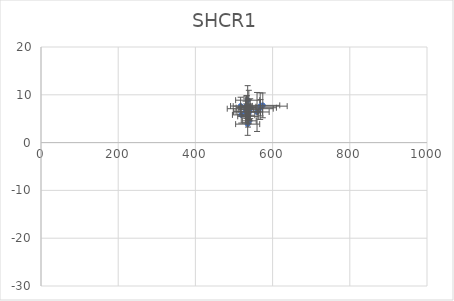
| Category | SHCR1 |
|---|---|
| 529.728784934635 | 6.41 |
| 535.4440969101128 | 8.871 |
| 574.5633435955032 | 7.789 |
| 559.689821405829 | 6.407 |
| 567.8550229824226 | 7.624 |
| 535.4440969101128 | 3.867 |
| 531.6610292941136 | 6.561 |
| 530.7194819856427 | 7.436 |
| 536.2403328467477 | 5.487 |
| 539.5881288620428 | 6.423 |
| 533.1372614086274 | 6.95 |
| 568.7124452920093 | 7.292 |
| 537.3501740549959 | 5.72 |
| 538.4496123859133 | 7.505 |
| 542.0796627146926 | 7.093 |
| 517.1353320258931 | 7.648 |
| 532.2972802863042 | 7.685 |
| 538.9556615007784 | 6.899 |
| 531.4116209954628 | 7.324 |
| 518.8133392211149 | 5.794 |
| 539.6160995873737 | 4.555 |